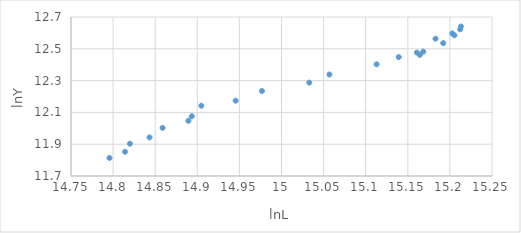
| Category | lnY |
|---|---|
| 14.795673089222689 | 11.814 |
| 14.814190948390609 | 11.852 |
| 14.819969768492316 | 11.903 |
| 14.843279434500802 | 11.942 |
| 14.858759067750176 | 12.003 |
| 14.889434444462315 | 12.047 |
| 14.893465095117683 | 12.076 |
| 14.904834103764014 | 12.142 |
| 14.945517990074325 | 12.174 |
| 14.97674957794506 | 12.234 |
| 15.032960528209012 | 12.287 |
| 15.056896546931286 | 12.338 |
| 15.112923116846606 | 12.403 |
| 15.139258923814495 | 12.448 |
| 15.164344028675483 | 12.462 |
| 15.160699427309444 | 12.476 |
| 15.16834662747836 | 12.482 |
| 15.192053914873446 | 12.536 |
| 15.182936960251597 | 12.564 |
| 15.205410441681178 | 12.585 |
| 15.202823581821061 | 12.597 |
| 15.21218687956394 | 12.623 |
| 15.21308949217036 | 12.64 |